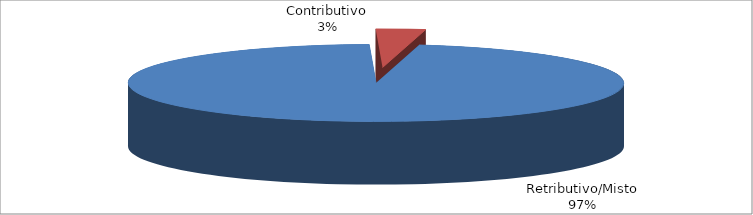
| Category | Decorrenti ANNO 2022 |
|---|---|
| Retributivo/Misto | 31961 |
| Contributivo | 1063 |